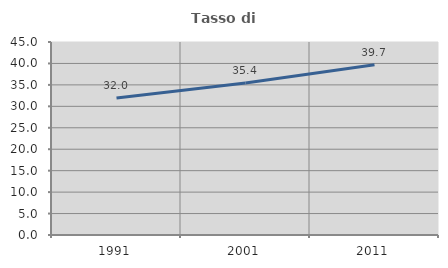
| Category | Tasso di occupazione   |
|---|---|
| 1991.0 | 31.957 |
| 2001.0 | 35.436 |
| 2011.0 | 39.709 |